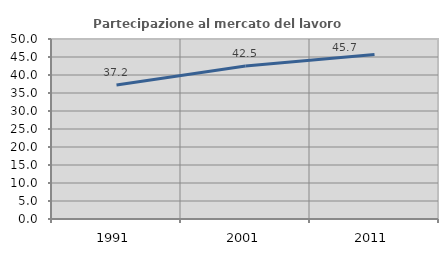
| Category | Partecipazione al mercato del lavoro  femminile |
|---|---|
| 1991.0 | 37.195 |
| 2001.0 | 42.521 |
| 2011.0 | 45.698 |